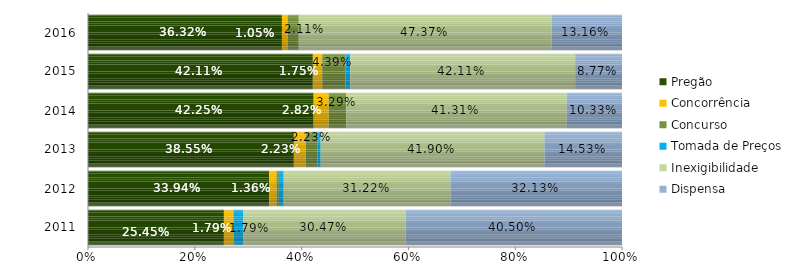
| Category | Pregão | Concorrência | Concurso | Tomada de Preços | Inexigibilidade | Dispensa |
|---|---|---|---|---|---|---|
| 2011.0 | 0.254 | 0.018 | 0 | 0.018 | 0.305 | 0.405 |
| 2012.0 | 0.339 | 0.014 | 0.005 | 0.009 | 0.312 | 0.321 |
| 2013.0 | 0.385 | 0.022 | 0.022 | 0.006 | 0.419 | 0.145 |
| 2014.0 | 0.423 | 0.028 | 0.033 | 0 | 0.413 | 0.103 |
| 2015.0 | 0.421 | 0.018 | 0.044 | 0.009 | 0.421 | 0.088 |
| 2016.0 | 0.363 | 0.011 | 0.021 | 0 | 0.474 | 0.132 |